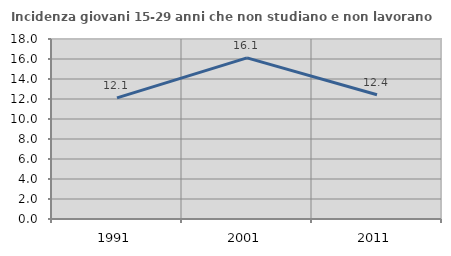
| Category | Incidenza giovani 15-29 anni che non studiano e non lavorano  |
|---|---|
| 1991.0 | 12.112 |
| 2001.0 | 16.111 |
| 2011.0 | 12.418 |